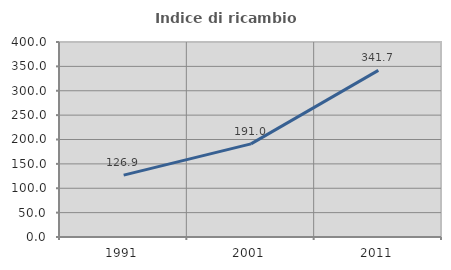
| Category | Indice di ricambio occupazionale  |
|---|---|
| 1991.0 | 126.894 |
| 2001.0 | 190.976 |
| 2011.0 | 341.732 |